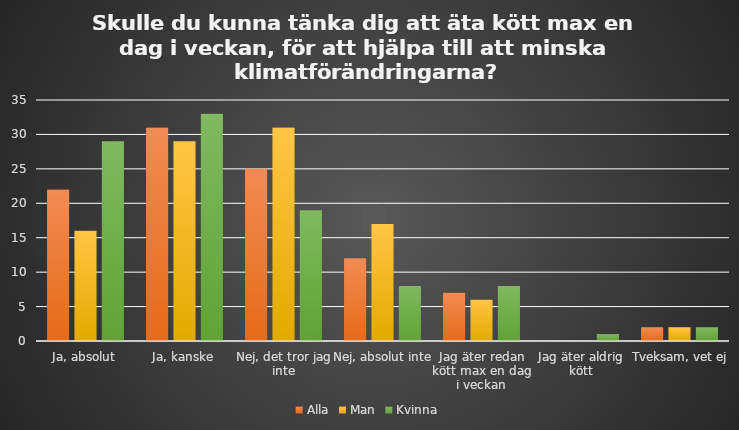
| Category | Alla | Man | Kvinna |
|---|---|---|---|
| Ja, absolut | 22 | 16 | 29 |
| Ja, kanske | 31 | 29 | 33 |
| Nej, det tror jag inte | 25 | 31 | 19 |
| Nej, absolut inte | 12 | 17 | 8 |
| Jag äter redan kött max en dag i veckan | 7 | 6 | 8 |
| Jag äter aldrig kött | 0 | 0 | 1 |
| Tveksam, vet ej | 2 | 2 | 2 |